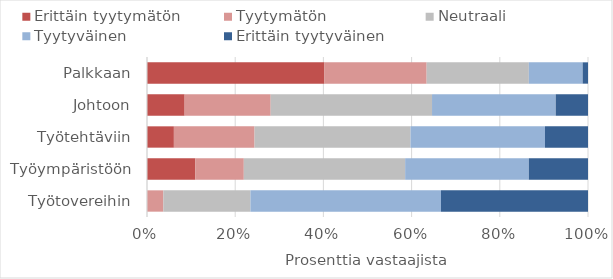
| Category | Erittäin tyytymätön | Tyytymätön | Neutraali | Tyytyväinen | Erittäin tyytyväinen |
|---|---|---|---|---|---|
| Työtovereihin | 0 | 3 | 16 | 35 | 27 |
| Työympäristöön | 9 | 9 | 30 | 23 | 11 |
| Työtehtäviin | 5 | 15 | 29 | 25 | 8 |
| Johtoon | 7 | 16 | 30 | 23 | 6 |
| Palkkaan | 33 | 19 | 19 | 10 | 1 |